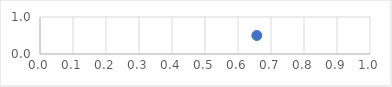
| Category | pont |
|---|---|
| 0.6570315694553628 | 0.5 |